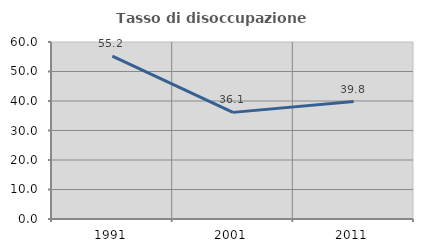
| Category | Tasso di disoccupazione giovanile  |
|---|---|
| 1991.0 | 55.245 |
| 2001.0 | 36.145 |
| 2011.0 | 39.806 |